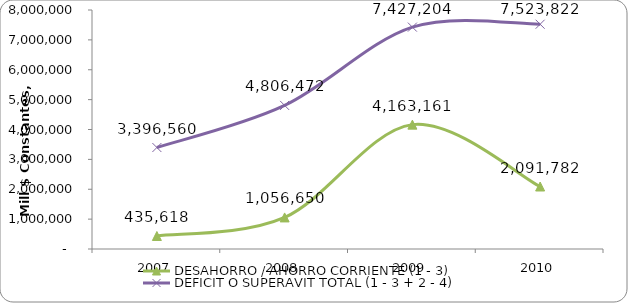
| Category | DESAHORRO / AHORRO CORRIENTE (1 - 3) | DEFICIT O SUPERAVIT TOTAL (1 - 3 + 2 - 4) |
|---|---|---|
| 2007 | 435618.439 | 3396559.571 |
| 2008 | 1056649.622 | 4806472.405 |
| 2009 | 4163161.235 | 7427204.173 |
| 2010 | 2091782 | 7523822 |